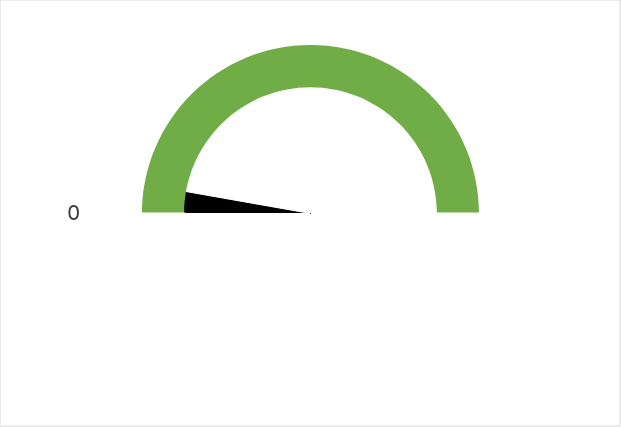
| Category | Series 1 |
|---|---|
| 0 | 0 |
| 1 | 2 |
| 2 | 70 |